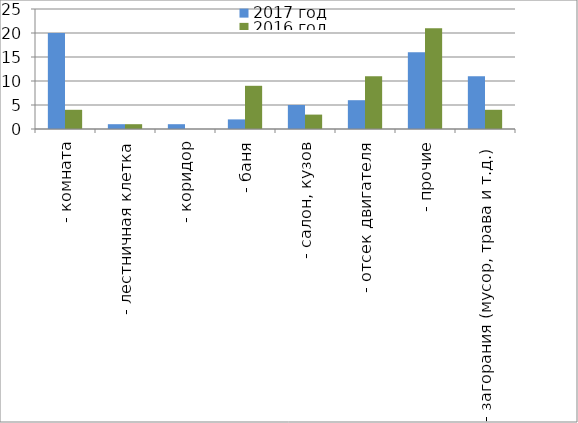
| Category | 2017 год | 2016 год |
|---|---|---|
|  - комната | 20 | 4 |
|  - лестничная клетка | 1 | 1 |
|  - коридор | 1 | 0 |
|  - баня | 2 | 9 |
|  - салон, кузов | 5 | 3 |
|  - отсек двигателя | 6 | 11 |
| - прочие | 16 | 21 |
| - загорания (мусор, трава и т.д.)  | 11 | 4 |